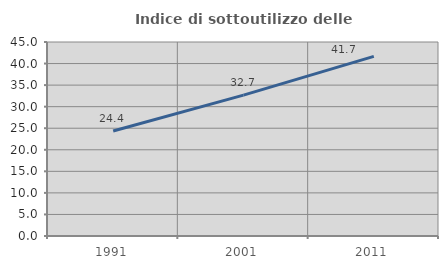
| Category | Indice di sottoutilizzo delle abitazioni  |
|---|---|
| 1991.0 | 24.365 |
| 2001.0 | 32.671 |
| 2011.0 | 41.674 |